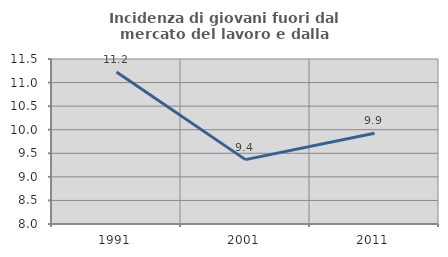
| Category | Incidenza di giovani fuori dal mercato del lavoro e dalla formazione  |
|---|---|
| 1991.0 | 11.227 |
| 2001.0 | 9.366 |
| 2011.0 | 9.924 |